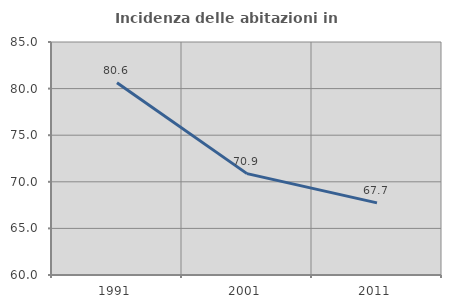
| Category | Incidenza delle abitazioni in proprietà  |
|---|---|
| 1991.0 | 80.631 |
| 2001.0 | 70.879 |
| 2011.0 | 67.739 |